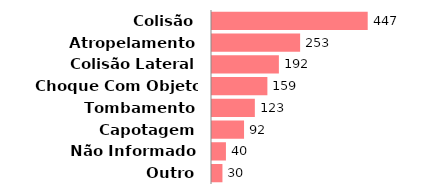
| Category | Qtde |
|---|---|
| Colisão | 447 |
| Atropelamento | 253 |
| Colisão Lateral | 192 |
| Choque Com Objeto Fixo | 159 |
| Tombamento | 123 |
| Capotagem | 92 |
| Não Informado | 40 |
| Outro | 30 |